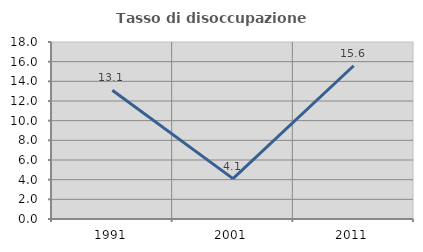
| Category | Tasso di disoccupazione giovanile  |
|---|---|
| 1991.0 | 13.095 |
| 2001.0 | 4.11 |
| 2011.0 | 15.584 |